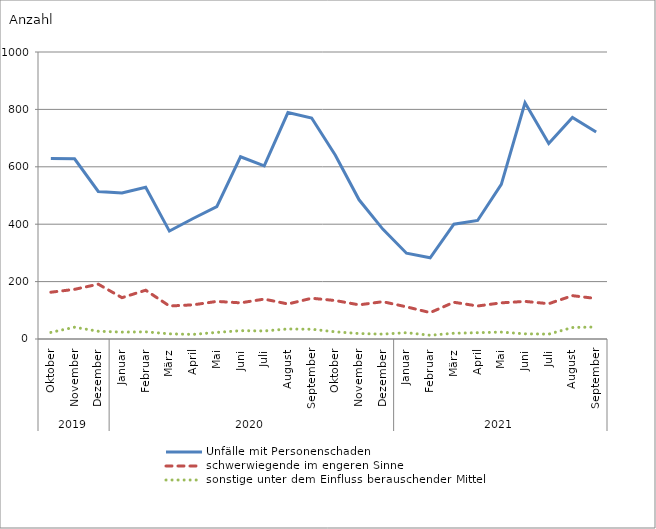
| Category | Unfälle mit Personenschaden | schwerwiegende im engeren Sinne | sonstige unter dem Einfluss berauschender Mittel |
|---|---|---|---|
| 0 | 629 | 163 | 23 |
| 1 | 628 | 173 | 41 |
| 2 | 514 | 191 | 27 |
| 3 | 509 | 144 | 24 |
| 4 | 529 | 170 | 25 |
| 5 | 376 | 115 | 18 |
| 6 | 420 | 119 | 16 |
| 7 | 461 | 131 | 23 |
| 8 | 635 | 126 | 29 |
| 9 | 603 | 139 | 28 |
| 10 | 789 | 122 | 35 |
| 11 | 770 | 142 | 34 |
| 12 | 640 | 134 | 25 |
| 13 | 485 | 119 | 19 |
| 14 | 383 | 130 | 17 |
| 15 | 299 | 112 | 22 |
| 16 | 283 | 92 | 13 |
| 17 | 400 | 128 | 20 |
| 18 | 413 | 115 | 22 |
| 19 | 539 | 126 | 24 |
| 20 | 823 | 131 | 18 |
| 21 | 681 | 123 | 17 |
| 22 | 772 | 151 | 40 |
| 23 | 721 | 141 | 42 |